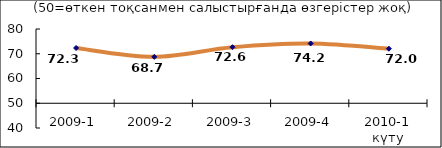
| Category | Диф.индекс ↓ |
|---|---|
| 2009-1 | 72.335 |
| 2009-2 | 68.745 |
| 2009-3 | 72.645 |
| 2009-4 | 74.155 |
| 2010-1 күту | 72.04 |